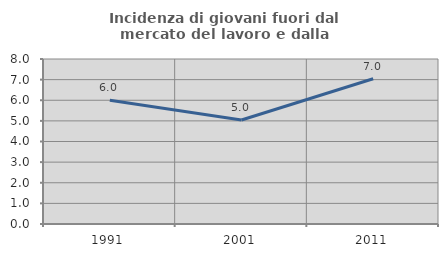
| Category | Incidenza di giovani fuori dal mercato del lavoro e dalla formazione  |
|---|---|
| 1991.0 | 5.997 |
| 2001.0 | 5.042 |
| 2011.0 | 7.042 |